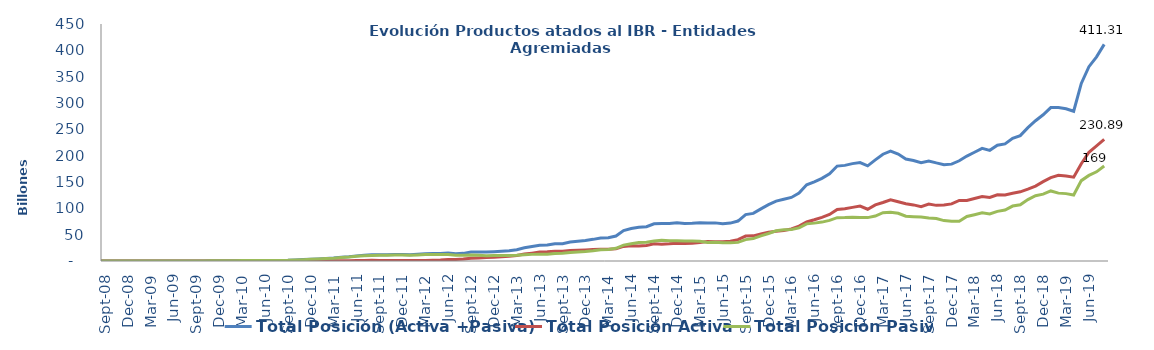
| Category | Total Posición (Activa +Pasiva) | Total Posición Activa | Total Posición Pasiva |
|---|---|---|---|
| 2008-07-01 | 0 | 0 | 0 |
| 2008-08-01 | 0 | 0 | 0 |
| 2008-09-01 | 1000000 | 0 | 1000000 |
| 2008-10-01 | 1000000 | 0 | 1000000 |
| 2008-11-01 | 0 | 0 | 0 |
| 2008-12-01 | 0 | 0 | 0 |
| 2009-01-01 | 0 | 0 | 0 |
| 2009-02-01 | 7428500000 | 7428500000 | 0 |
| 2009-03-01 | 7428500000 | 7428500000 | 0 |
| 2009-04-01 | 7428500000 | 7428500000 | 0 |
| 2009-05-01 | 7428500000 | 7428500000 | 0 |
| 2009-06-01 | 7428500000 | 7428500000 | 0 |
| 2009-07-01 | 184628500000 | 7428500000 | 177200000000 |
| 2009-08-01 | 184628500000 | 7428500000 | 177200000000 |
| 2009-09-01 | 184628500000 | 7428500000 | 177200000000 |
| 2009-10-01 | 185129500000 | 7928500000 | 177201000000 |
| 2009-11-01 | 333829500000 | 22928500000 | 310901000000 |
| 2009-12-01 | 508529500000 | 22928500000 | 485601000000 |
| 2010-01-01 | 523329500000 | 23328500000 | 500001000000 |
| 2010-02-01 | 561579500000 | 23328500000 | 538251000000 |
| 2010-03-01 | 890799500000 | 24228500000 | 866571000000 |
| 2010-04-01 | 934149500000 | 32228500000 | 901921000000 |
| 2010-05-01 | 972149500000 | 46928500000 | 925221000000 |
| 2010-06-01 | 1019749500000 | 57928500000 | 961821000000 |
| 2010-07-01 | 1054749500000 | 71928500000 | 982821000000 |
| 2010-08-01 | 1096821000000 | 66500000000 | 1030321000000 |
| 2010-09-01 | 1351421000000 | 57500000000 | 1293921000000 |
| 2010-10-01 | 2086289000000 | 111000000000 | 1975289000000 |
| 2010-11-01 | 2726579030230 | 114000000000 | 2612579030230 |
| 2010-12-01 | 3205380030230 | 113971000000 | 3091409030230 |
| 2011-01-01 | 3891216030230 | 114971000000 | 3776245030230 |
| 2011-02-01 | 4740024311520 | 219471000000 | 4520553311520 |
| 2011-03-01 | 5575075311520 | 377371000000 | 5197704311520 |
| 2011-04-01 | 7038592281290 | 509371000000 | 6529221281290 |
| 2011-05-01 | 8099489881774 | 597145000000 | 7502344881774 |
| 2011-06-01 | 9725086346191 | 765169000000 | 8959917346191 |
| 2011-07-01 | 10999513570652 | 996669000000 | 10002844570652 |
| 2011-08-01 | 11811490085668 | 1214169000000 | 10597321085668 |
| 2011-09-01 | 12092316282168 | 1148069000000 | 10944247282168 |
| 2011-10-01 | 11974470459718 | 1135571874050 | 10838898585668 |
| 2011-11-01 | 12176418287184 | 984599000000 | 11191819287184 |
| 2011-12-01 | 12288842763684 | 983099000000 | 11305743763684 |
| 2012-01-01 | 11701287811238 | 1008599000000 | 10692688811238 |
| 2012-02-01 | 12706230411238 | 1105569000000 | 11600661411238 |
| 2012-03-01 | 13561575207334 | 1160099000000 | 12401476207334 |
| 2012-04-01 | 14046325467338 | 1471099000000 | 12575226467338 |
| 2012-05-01 | 14094647073338 | 1804949000000 | 12289698073338 |
| 2012-06-01 | 14980264763536 | 2682753000000 | 12297511763536 |
| 2012-07-01 | 13983506536392.6 | 2975989400932.6 | 11007517135460 |
| 2012-08-01 | 14511342381537.73 | 3747251409383.73 | 10764090972154 |
| 2012-09-01 | 16937362887762.46 | 5346076915608.46 | 11591285972154 |
| 2012-10-01 | 16867323467297.76 | 5927222995143.76 | 10940100472154 |
| 2012-11-01 | 16957687120024.45 | 6827721606539.45 | 10129965513485 |
| 2012-12-01 | 17619213721064.83 | 7264421085065.83 | 10354792635999 |
| 2013-01-01 | 18549778788681.95 | 8296359799905.279 | 10253418988776.67 |
| 2013-02-01 | 19435840251568.38 | 9025528305106.379 | 10410311946462 |
| 2013-03-01 | 21350496757475.97 | 10610182541484.97 | 10740314215991 |
| 2013-04-01 | 25044328892886.617 | 13133059577950.62 | 11911269314936 |
| 2013-05-01 | 27540403190960.062 | 14960233266686.31 | 12580169924273.75 |
| 2013-06-01 | 30001766547101.754 | 17049524776131 | 12952241770970.75 |
| 2013-07-01 | 30415841990108.754 | 17382486278583 | 13033355711525.75 |
| 2013-08-01 | 32855099846458.246 | 18580739748972 | 14274360097486.25 |
| 2013-09-01 | 32976502369371.246 | 18407429561787 | 14569072807584.25 |
| 2013-10-01 | 35959569368735.19 | 19992346917073.383 | 15967222451661.8 |
| 2013-11-01 | 37338647357799.75 | 20384941433230.95 | 16953705924568.8 |
| 2013-12-01 | 38888505779144.55 | 20939970782609.754 | 17948534996534.8 |
| 2014-01-01 | 41103172396366.16 | 21609706461008.36 | 19493465935357.8 |
| 2014-02-01 | 43730091166840.81 | 22338455450529.008 | 21391635716311.8 |
| 2014-03-01 | 44014768230115.07 | 22272030193312.27 | 21742738036802.8 |
| 2014-04-01 | 47430724239336.83 | 23422937479203.03 | 24007786760133.8 |
| 2014-05-01 | 57834426276868.516 | 27674659964612.28 | 30159766312256.23 |
| 2014-06-01 | 61600955025680.43 | 28872171652456.2 | 32728783373224.23 |
| 2014-07-01 | 63885132140809.125 | 28702458561582.03 | 35182673579227.09 |
| 2014-08-01 | 65175133555848.31 | 29435167088741.88 | 35739966467106.44 |
| 2014-09-01 | 70606691467799.84 | 32831024190733.098 | 37775667277066.74 |
| 2014-10-01 | 71051997442592.78 | 31855183242802.297 | 39196814199790.49 |
| 2014-11-01 | 71115134748566.56 | 32585871229814.906 | 38529263518751.65 |
| 2014-12-01 | 72525676073088.9 | 33921493945222.32 | 38604182127866.58 |
| 2015-01-01 | 71271574040027.69 | 33430948122193.57 | 37840625917834.125 |
| 2015-02-01 | 71566513266069.4 | 33707551044151.4 | 37858962221918 |
| 2015-03-01 | 72569028292197.1 | 35240251694194.734 | 37328776598002.37 |
| 2015-04-01 | 72284407635002.38 | 36978226535327.29 | 35306181099675.08 |
| 2015-05-01 | 72379825993554.31 | 36677826813740.74 | 35701999179813.58 |
| 2015-06-01 | 70934232494211.97 | 36341054921697.64 | 34593177572514.32 |
| 2015-07-01 | 71925911515818.6 | 37449597485067.67 | 34476314030750.92 |
| 2015-08-01 | 75819411537731.48 | 40476268719214.67 | 35343142818516.81 |
| 2015-09-01 | 88024514896767.1 | 47423423192943 | 40601091703824.09 |
| 2015-10-01 | 90376727278611.56 | 47767203933521.14 | 42609523345090.43 |
| 2015-11-01 | 99012993745053.11 | 51298569770898.03 | 47714423974155.08 |
| 2015-12-01 | 107008749487979.02 | 54758099038919.11 | 52250650449059.89 |
| 2016-01-01 | 113661574588642.9 | 56331160756973.97 | 57330413831668.94 |
| 2016-02-01 | 117225015006954.34 | 57909509197116.14 | 59315505809838.21 |
| 2016-03-01 | 120669820452450.66 | 60722748977001.484 | 59947071475449.17 |
| 2016-04-01 | 129040983634768.84 | 66178255126135.42 | 62862728508633.42 |
| 2016-05-01 | 144700379703761.53 | 74162617699926 | 70537762003835.53 |
| 2016-06-01 | 150304379111854.44 | 78377250605963.84 | 71927128505890.6 |
| 2016-07-01 | 156812723823687.1 | 82955508331840.11 | 73857215491846.98 |
| 2016-08-01 | 165444572236951 | 88276550125987.88 | 77168022110963.12 |
| 2016-09-01 | 180247481204752.16 | 97990348411005.16 | 82257132793747.02 |
| 2016-10-01 | 181569726283085.44 | 99190320785310.78 | 82379405497774.64 |
| 2016-11-01 | 184930356175967.25 | 101858145365331.95 | 83072210810635.31 |
| 2016-12-01 | 187019078701499.56 | 104426020271926.45 | 82593058429573.12 |
| 2017-01-01 | 180717599779259.44 | 98342098801930.34 | 82375500977329.1 |
| 2017-02-01 | 191914936110978.38 | 106635932569865.05 | 85279003541113.31 |
| 2017-03-01 | 202712151186918.75 | 111093841827062.03 | 91618309359856.7 |
| 2017-04-01 | 208712921786598.44 | 116358628666288.72 | 92354293120309.72 |
| 2017-05-01 | 203156118525042.3 | 112464530045620.02 | 90691588479422.28 |
| 2017-06-01 | 193587897232076.56 | 108642745845616.36 | 84945151386460.22 |
| 2017-07-01 | 190785975919763.38 | 106534349795344.66 | 84251626124418.72 |
| 2017-08-01 | 186835458365348.25 | 103243442359903.69 | 83592016005444.58 |
| 2017-09-01 | 189956082995096.8 | 108148190109574.17 | 81807892885522.62 |
| 2017-10-01 | 186238156699396.06 | 105639300759532 | 80598855939864.06 |
| 2017-11-01 | 182912971216385.97 | 106198065459860.58 | 76714905756525.44 |
| 2017-12-01 | 183933570178700.62 | 108408970543558.03 | 75524599635142.58 |
| 2018-01-01 | 190291441132458.47 | 114943825229509.72 | 75347615902948.75 |
| 2018-02-01 | 199264228670704.5 | 114794441925964.78 | 84469786744739.73 |
| 2018-03-01 | 206466045046535.78 | 118542976386628.56 | 87923068659907.22 |
| 2018-04-01 | 213915910263754.12 | 122316493524125.72 | 91599416739628.39 |
| 2018-05-01 | 210096680547626.72 | 120682410832846.97 | 89414269714779.75 |
| 2018-06-01 | 219790743438447.56 | 125584292257677.75 | 94206451180769.8 |
| 2018-07-01 | 222353548785559.88 | 125490160168957.62 | 96863388616602.25 |
| 2018-08-01 | 233086052049531.72 | 128762857401461.97 | 104323194648069.75 |
| 2018-09-01 | 238027301564301.2 | 131365417268308.8 | 106661884295992.39 |
| 2018-10-01 | 253273663285084.7 | 136616212577415.81 | 116657450707668.86 |
| 2018-11-01 | 266330047851210.72 | 142363157445231.12 | 123966890405979.6 |
| 2018-12-01 | 277618341802917.44 | 150720411980092.44 | 126897929822825.02 |
| 2019-01-01 | 291292794708075.9 | 158270778995387.56 | 133022015712688.28 |
| 2019-02-01 | 291485324151048.5 | 162610186424391.3 | 128875137726657.22 |
| 2019-03-01 | 289168578743758.4 | 161244314539374.06 | 127924264204384.34 |
| 2019-04-01 | 284312273074189.56 | 159136639592346.12 | 125175633481843.44 |
| 2019-05-01 | 337185426527509.75 | 184618287806282.9 | 152567138721226.88 |
| 2019-06-01 | 368930768189665.06 | 206410540298487.2 | 162520227891177.88 |
| 2019-07-01 | 387727178740432.4 | 218422632039062.62 | 169304546701369.75 |
| 2019-08-01 | 411308655733076.8 | 230886460814072.1 | 180422194919004.72 |